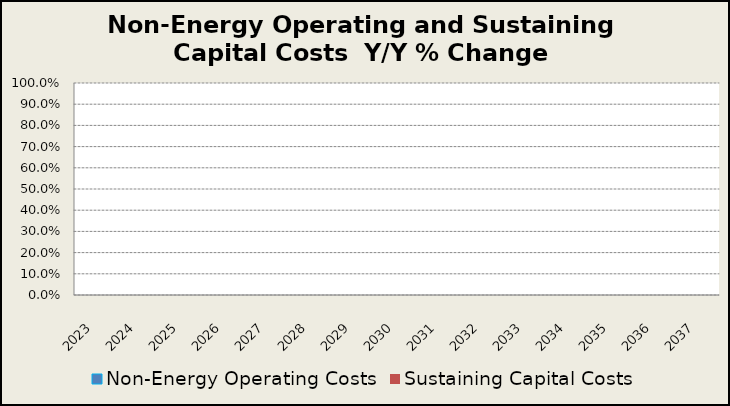
| Category | Non-Energy Operating Costs  | Sustaining Capital Costs |
|---|---|---|
| 2023.0 | 0 | 0 |
| 2024.0 | 0 | 0 |
| 2025.0 | 0 | 0 |
| 2026.0 | 0 | 0 |
| 2027.0 | 0 | 0 |
| 2028.0 | 0 | 0 |
| 2029.0 | 0 | 0 |
| 2030.0 | 0 | 0 |
| 2031.0 | 0 | 0 |
| 2032.0 | 0 | 0 |
| 2033.0 | 0 | 0 |
| 2034.0 | 0 | 0 |
| 2035.0 | 0 | 0 |
| 2036.0 | 0 | 0 |
| 2037.0 | 0 | 0 |